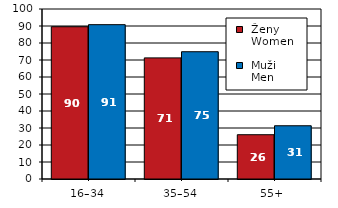
| Category |  Ženy 
 Women |  Muži 
 Men |
|---|---|---|
| 16–34 | 89.57 | 90.79 |
| 35–54 | 71.25 | 74.87 |
| 55+  | 26.05 | 31.32 |